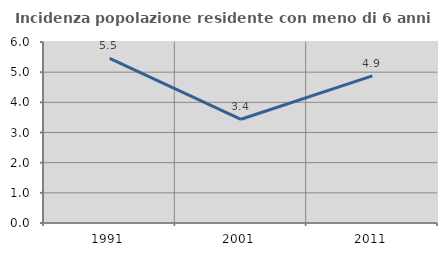
| Category | Incidenza popolazione residente con meno di 6 anni |
|---|---|
| 1991.0 | 5.455 |
| 2001.0 | 3.438 |
| 2011.0 | 4.878 |